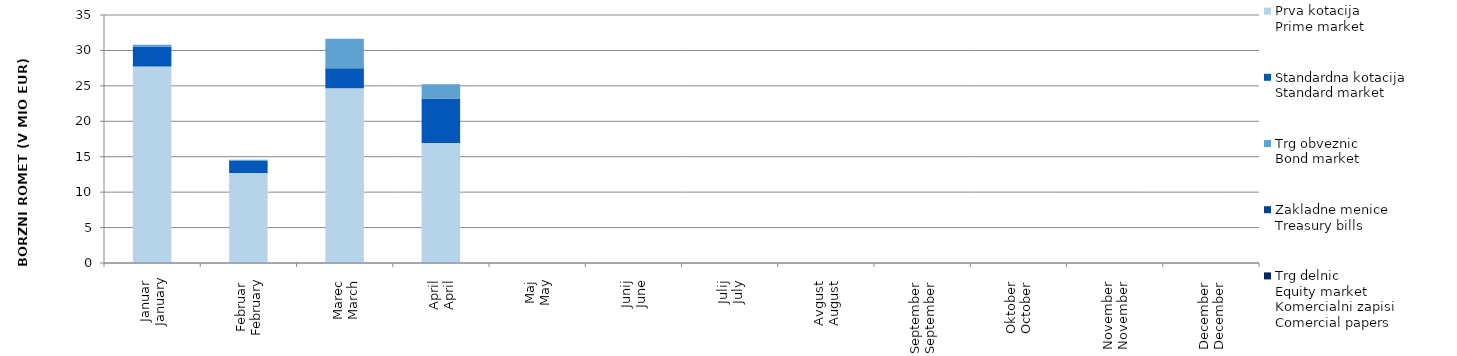
| Category | Prva kotacija
Prime market | Standardna kotacija
Standard market | Trg obveznic
Bond market | Zakladne menice
Treasury bills | Trg delnic
Equity market |
|---|---|---|---|---|---|
| Januar
January | 27.745 | 2.796 | 0.249 | 0 | 0 |
| Februar
February | 12.685 | 1.784 | 0.118 | 0 | 0 |
| Marec
March | 24.676 | 2.813 | 4.174 | 0 | 0 |
| April
April | 16.942 | 6.272 | 2.01 | 0 | 0 |
| Maj
May | 0 | 0 | 0 | 0 | 0 |
| Junij
June | 0 | 0 | 0 | 0 | 0 |
| Julij
July | 0 | 0 | 0 | 0 | 0 |
| Avgust
August | 0 | 0 | 0 | 0 | 0 |
| September
September | 0 | 0 | 0 | 0 | 0 |
| Oktober
October | 0 | 0 | 0 | 0 | 0 |
| November
November | 0 | 0 | 0 | 0 | 0 |
| December
December | 0 | 0 | 0 | 0 | 0 |